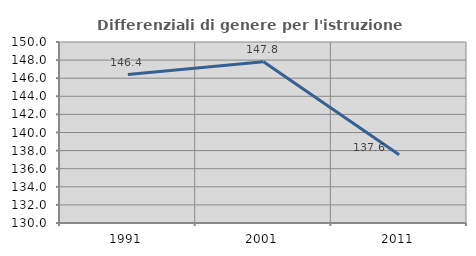
| Category | Differenziali di genere per l'istruzione superiore |
|---|---|
| 1991.0 | 146.407 |
| 2001.0 | 147.816 |
| 2011.0 | 137.553 |